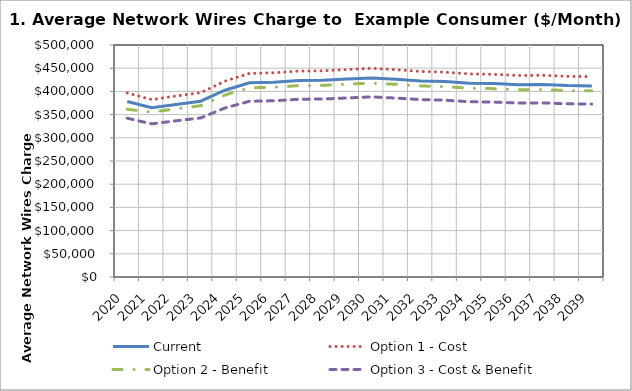
| Category | Current | Option 1 - Cost | Option 2 - Benefit | Option 3 - Cost & Benefit |
|---|---|---|---|---|
| 2020.0 | 378370.8 | 396602.784 | 361512.383 | 342316.202 |
| 2021.0 | 364784.4 | 382316.323 | 355313.23 | 329985.257 |
| 2022.0 | 371994 | 390058.002 | 362508.113 | 336667.263 |
| 2023.0 | 378904.8 | 397191.744 | 369137.996 | 342824.546 |
| 2024.0 | 402529.2 | 422086.871 | 392274.774 | 364312.053 |
| 2025.0 | 418590 | 438776.984 | 407786.061 | 378717.641 |
| 2026.0 | 419875.2 | 440069.67 | 408987.444 | 379833.385 |
| 2027.0 | 423381.6 | 443707.258 | 412368.108 | 382973.064 |
| 2028.0 | 423963.6 | 444351.067 | 412966.445 | 383528.749 |
| 2029.0 | 426684 | 447130.12 | 415549.212 | 385927.408 |
| 2030.0 | 428982 | 449762.834 | 417995.977 | 388199.759 |
| 2031.0 | 426154.8 | 446727.509 | 415175.039 | 385579.907 |
| 2032.0 | 422600.4 | 443002.953 | 411713.549 | 382365.163 |
| 2033.0 | 421262.4 | 441473.134 | 410291.781 | 381044.745 |
| 2034.0 | 417630 | 437681.42 | 406767.877 | 377772.036 |
| 2035.0 | 416850 | 436787.3 | 405936.908 | 377000.302 |
| 2036.0 | 414357.6 | 434301.42 | 403626.607 | 374854.687 |
| 2037.0 | 414759.6 | 434750.694 | 404044.148 | 375242.465 |
| 2038.0 | 412616.4 | 432495.071 | 401947.841 | 373295.59 |
| 2039.0 | 411757.2 | 431724.106 | 401231.329 | 372630.153 |